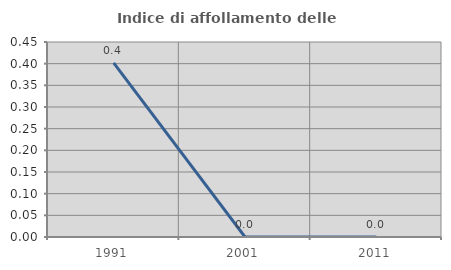
| Category | Indice di affollamento delle abitazioni  |
|---|---|
| 1991.0 | 0.402 |
| 2001.0 | 0 |
| 2011.0 | 0 |